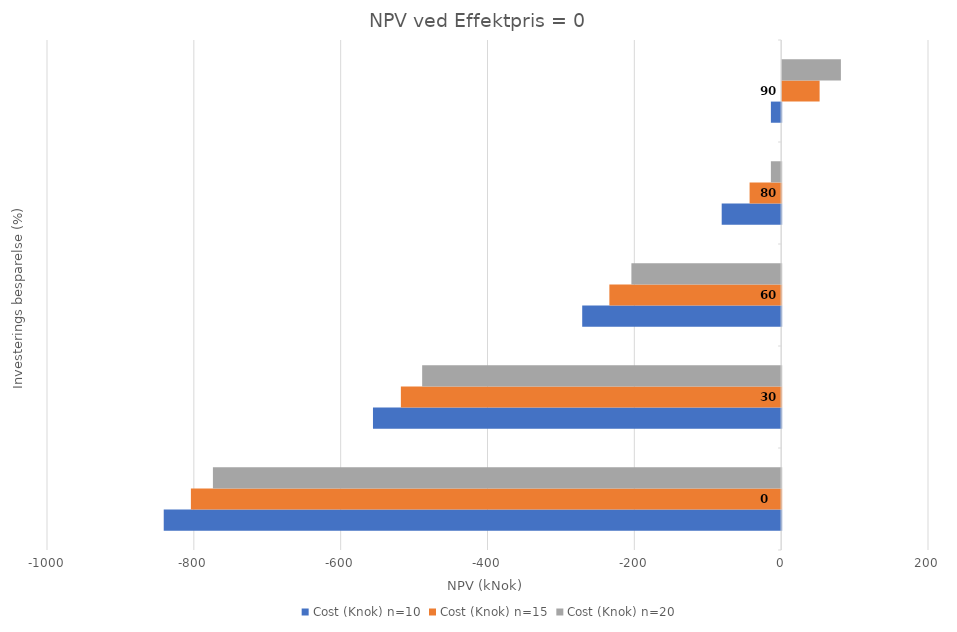
| Category | Cost (Knok) n=10 | Cost (Knok) n=15 | Cost (Knok) n=20 |
|---|---|---|---|
| 0.0 | -841 | -804 | -774 |
| 30.0 | -556 | -518 | -489 |
| 60.0 | -271 | -234 | -204 |
| 80.0 | -81 | -43 | -14 |
| 90.0 | -14 | 51 | 80 |